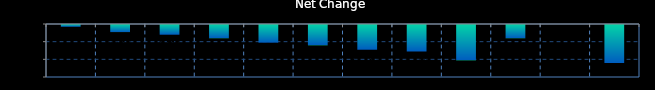
| Category | Series 0 |
|---|---|
| 0 | -0.02 |
| 1 | -0.08 |
| 2 | -0.11 |
| 3 | -0.15 |
| 4 | -0.2 |
| 5 | -0.23 |
| 6 | -0.28 |
| 7 | -0.3 |
| 8 | -0.4 |
| 9 | -0.15 |
| 10 | 0 |
| 11 | -0.43 |